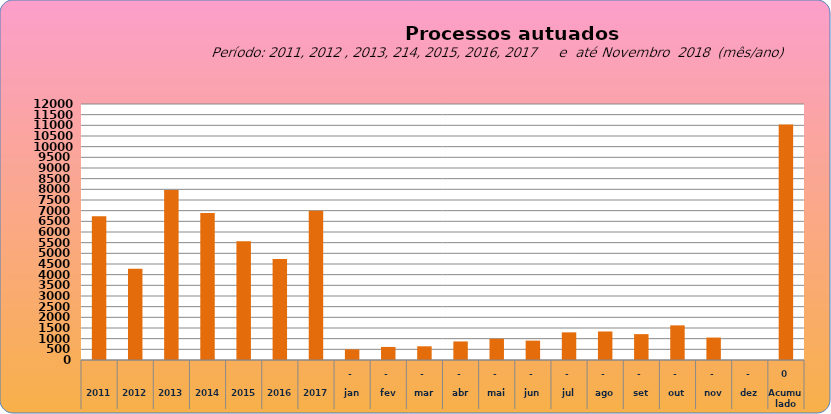
| Category | 6735 |
|---|---|
| 2011 | 6735 |
| 2012 | 4276 |
| 2013 | 7967 |
| 2014 | 6893 |
| 2015 | 5569 |
| 2016 | 4737 |
| 2017 | 6997 |
| jan | 498 |
| fev | 612 |
| mar | 642 |
| abr | 870 |
| mai | 995 |
| jun | 908 |
| jul | 1296 |
| ago | 1337 |
| set | 1212 |
| out | 1623 |
| nov | 1051 |
| dez | 0 |
| Acumulado
 | 11044 |